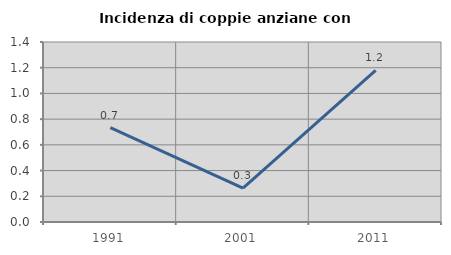
| Category | Incidenza di coppie anziane con figli |
|---|---|
| 1991.0 | 0.733 |
| 2001.0 | 0.263 |
| 2011.0 | 1.18 |